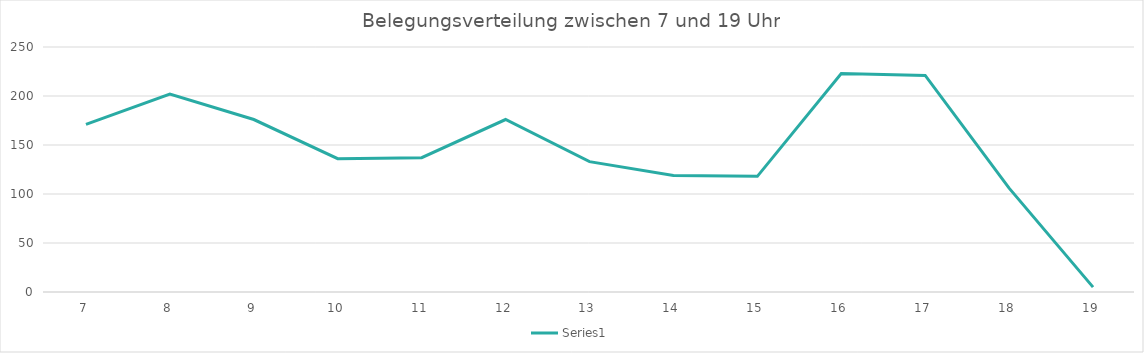
| Category | Series 1 |
|---|---|
| 7.0 | 171 |
| 8.0 | 202 |
| 9.0 | 176 |
| 10.0 | 136 |
| 11.0 | 137 |
| 12.0 | 176 |
| 13.0 | 133 |
| 14.0 | 119 |
| 15.0 | 118 |
| 16.0 | 223 |
| 17.0 | 221 |
| 18.0 | 106 |
| 19.0 | 5 |